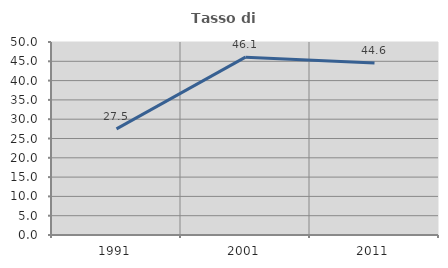
| Category | Tasso di occupazione   |
|---|---|
| 1991.0 | 27.5 |
| 2001.0 | 46.078 |
| 2011.0 | 44.565 |